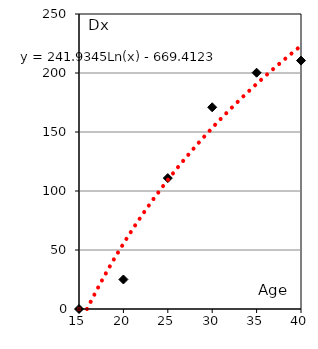
| Category | Series 0 |
|---|---|
| 15.0 | 0 |
| 20.0 | 25.02 |
| 25.0 | 110.95 |
| 30.0 | 170.96 |
| 35.0 | 200.26 |
| 40.0 | 210.53 |